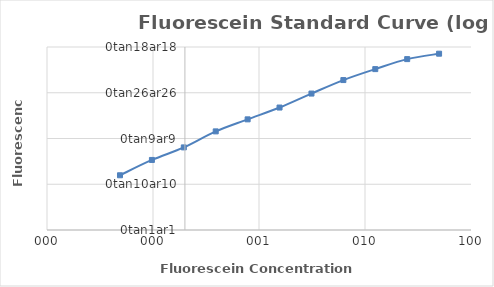
| Category | Series 0 |
|---|---|
| 50.0 | 7142 |
| 25.0 | 5432.25 |
| 12.5 | 3286.5 |
| 6.25 | 1892.75 |
| 3.125 | 959.7 |
| 1.5625 | 475.225 |
| 0.78125 | 262.15 |
| 0.390625 | 143.1 |
| 0.1953125 | 63.885 |
| 0.09765625 | 33.975 |
| 0.048828125 | 15.715 |